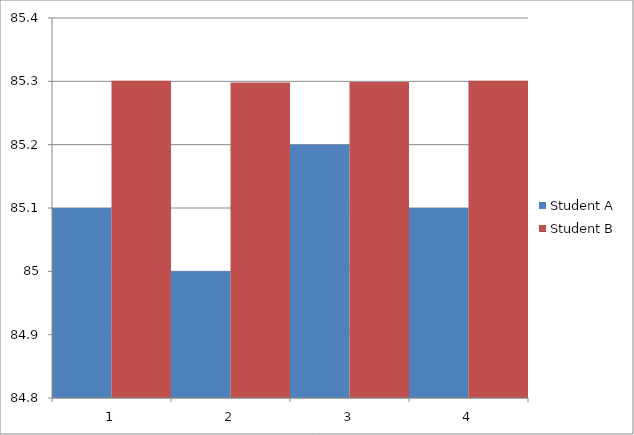
| Category | Student A | Student B |
|---|---|---|
| 0 | 85.1 | 85.301 |
| 1 | 85 | 85.298 |
| 2 | 85.2 | 85.299 |
| 3 | 85.1 | 85.301 |